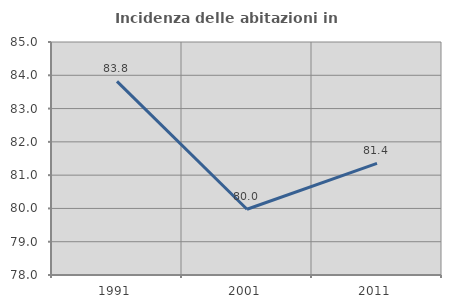
| Category | Incidenza delle abitazioni in proprietà  |
|---|---|
| 1991.0 | 83.817 |
| 2001.0 | 79.974 |
| 2011.0 | 81.352 |